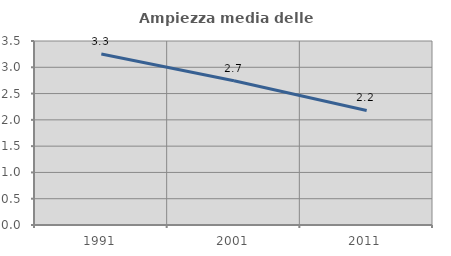
| Category | Ampiezza media delle famiglie |
|---|---|
| 1991.0 | 3.254 |
| 2001.0 | 2.742 |
| 2011.0 | 2.178 |